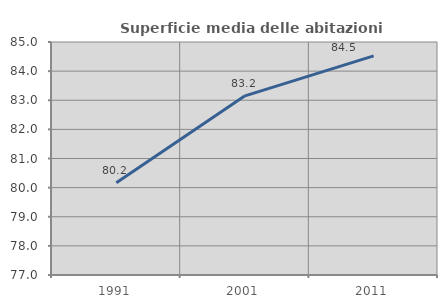
| Category | Superficie media delle abitazioni occupate |
|---|---|
| 1991.0 | 80.168 |
| 2001.0 | 83.152 |
| 2011.0 | 84.525 |